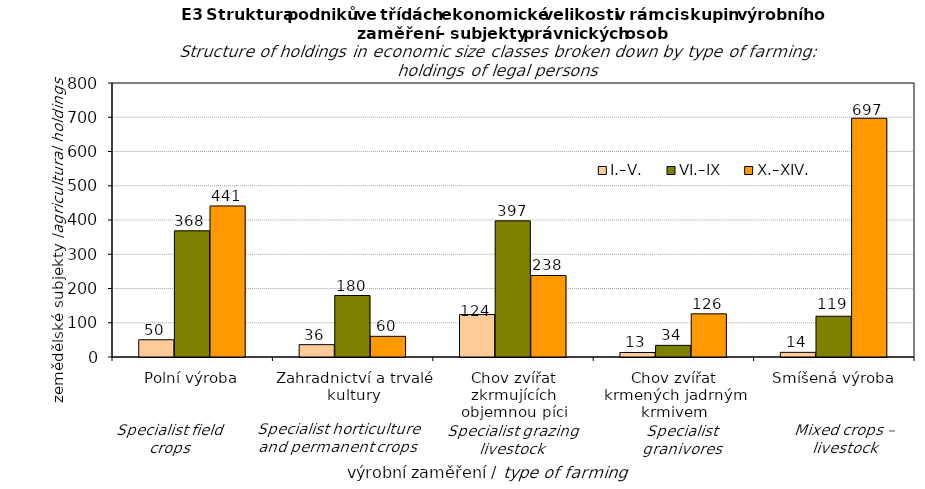
| Category | I.–V. | VI.–IX | X.–XIV. |
|---|---|---|---|
| Polní výroba | 50.354 | 368.462 | 441 |
| Zahradnictví a trvalé kultury | 36 | 179.538 | 60.386 |
| Chov zvířat zkrmujících objemnou píci | 123.973 | 397.49 | 238 |
| Chov zvířat krmených jadrným krmivem | 13.176 | 34 | 126 |
| Smíšená výroba | 13.565 | 119 | 697 |